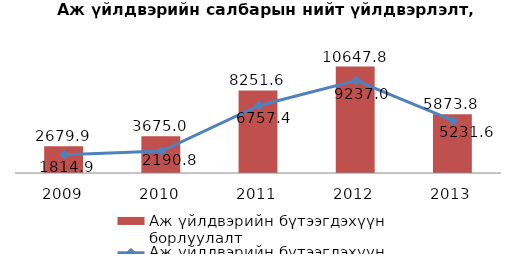
| Category | Аж үйлдвэрийн бүтээгдэхүүн борлуулалт |
|---|---|
| 2009.0 | 2679.9 |
| 2010.0 | 3675 |
| 2011.0 | 8251.6 |
| 2012.0 | 10647.8 |
| 2013.0 | 5873.8 |